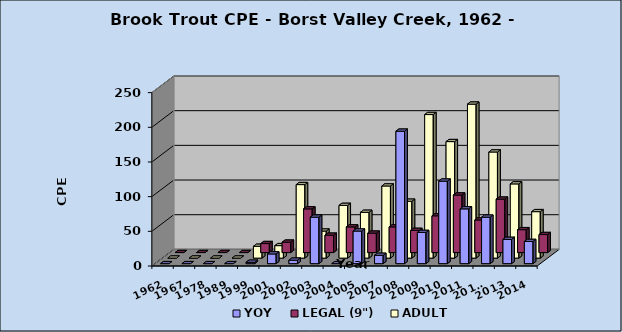
| Category | YOY | LEGAL (9") | ADULT |
|---|---|---|---|
| 1962 | 0 | 0 | 0 |
| 1967 | 0 | 0 | 0 |
| 1978 | 0 | 0 | 0 |
| 1989 | 0 | 0 | 0 |
| 1999 | 2 | 13 | 17 |
| 2001 | 14 | 15 | 18 |
| 2002 | 5 | 63 | 106 |
| 2003 | 67 | 25 | 39 |
| 2004 | 0 | 37 | 76 |
| 2005 | 47 | 28 | 66 |
| 2007 | 12 | 37 | 104 |
| 2008 | 191 | 32 | 82 |
| 2009 | 45 | 53 | 207 |
| 2010 | 119 | 83 | 168 |
| 2011 | 79 | 47 | 222 |
| 2012* | 67 | 77 | 153 |
| 2013 | 35 | 33 | 107 |
| 2014 | 32 | 26 | 67 |